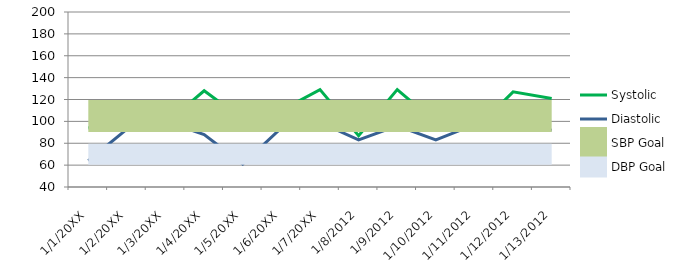
| Category | Systolic | Diastolic | SBP Goal | DBP Goal |
|---|---|---|---|---|
| 1/1/20XX | 94 | 64 | 105 | 70 |
| 1/2/20XX | 101 | 93 | 105 | 70 |
| 1/3/20XX | 98 | 100 | 105 | 70 |
| 1/4/20XX | 128 | 88 | 105 | 70 |
| 1/5/20XX | 102 | 61 | 105 | 70 |
| 1/6/20XX | 110 | 94 | 105 | 70 |
| 1/7/20XX | 129 | 99 | 105 | 70 |
| 1/8/2012 | 87 | 83 | 105 | 70 |
| 1/9/2012 | 129 | 96 | 105 | 70 |
| 1/10/2012 | 99 | 83 | 105 | 70 |
| 1/11/2012 | 92 | 97 | 105 | 70 |
| 1/12/2012 | 127 | 97 | 105 | 70 |
| 1/13/2012 | 121 | 92 | 105 | 70 |